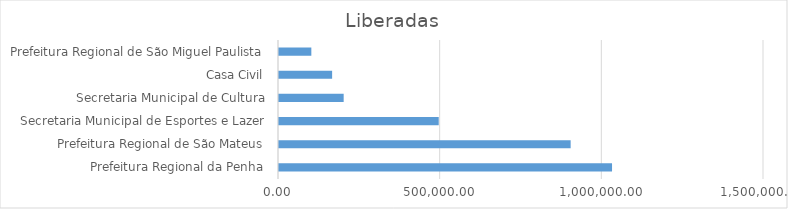
| Category | Series 0 |
|---|---|
| Prefeitura Regional da Penha | 1030000 |
| Prefeitura Regional de São Mateus | 902000 |
| Secretaria Municipal de Esportes e Lazer | 494000 |
| Secretaria Municipal de Cultura | 200000 |
| Casa Civil | 164292 |
| Prefeitura Regional de São Miguel Paulista | 100000 |